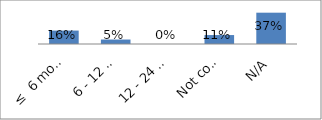
| Category | Series 0 |
|---|---|
| ≤  6 months after the end of the FY | 0.158 |
| 6 - 12 months after the end of the FY | 0.053 |
| 12 - 24 months after the end of the FY | 0 |
| Not completed within 24 months after the end of the FY | 0.105 |
| N/A | 0.368 |